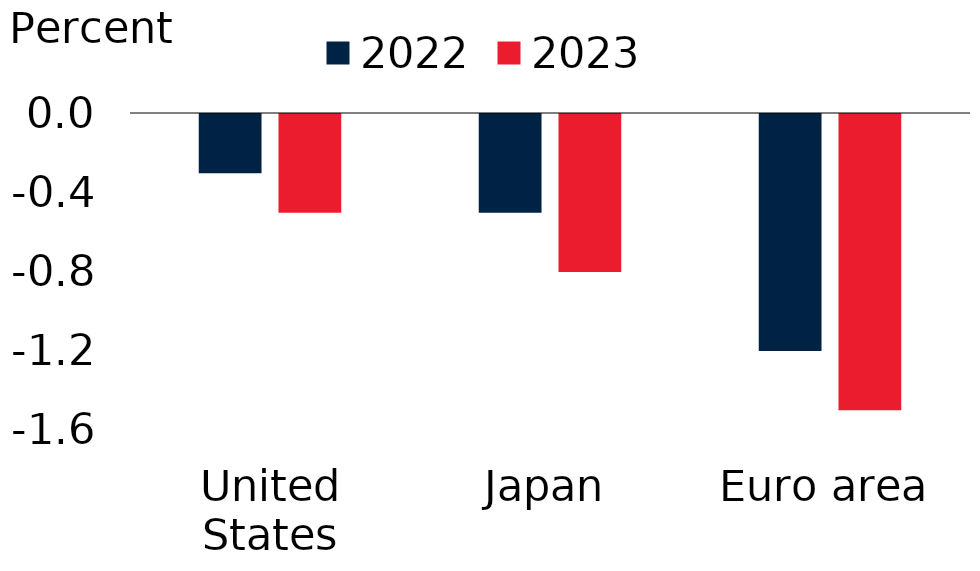
| Category | 2022 | 2023 |
|---|---|---|
| United States | -0.3 | -0.5 |
| Japan | -0.5 | -0.8 |
| Euro area | -1.2 | -1.5 |